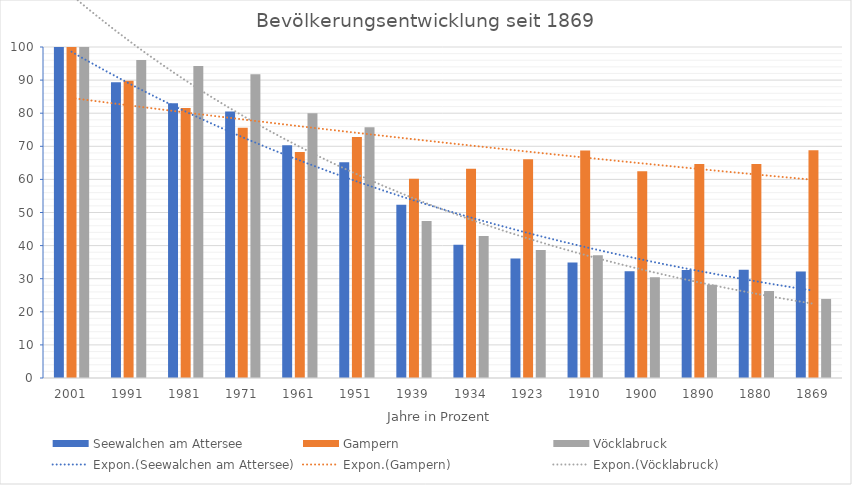
| Category | Seewalchen am Attersee | Gampern | Vöcklabruck |
|---|---|---|---|
| 2001.0 | 100 | 100 | 100 |
| 1991.0 | 89.33 | 89.773 | 96.109 |
| 1981.0 | 82.987 | 81.575 | 94.228 |
| 1971.0 | 80.55 | 75.568 | 91.774 |
| 1961.0 | 70.3 | 68.304 | 79.981 |
| 1951.0 | 65.217 | 72.808 | 75.74 |
| 1939.0 | 52.321 | 60.187 | 47.426 |
| 1934.0 | 40.244 | 63.231 | 42.902 |
| 1923.0 | 36.085 | 66.112 | 38.652 |
| 1910.0 | 34.93 | 68.75 | 37.096 |
| 1900.0 | 32.241 | 62.5 | 30.46 |
| 1890.0 | 32.661 | 64.651 | 28.168 |
| 1880.0 | 32.682 | 64.651 | 26.304 |
| 1869.0 | 32.178 | 68.791 | 23.893 |